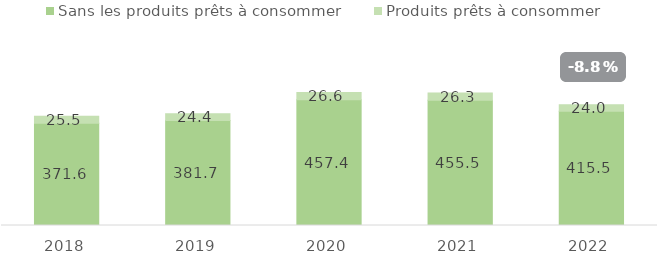
| Category | Sans les produits prêts à consommer | Produits prêts à consommer |
|---|---|---|
| 2018.0 | 371.594 | 25.535 |
| 2019.0 | 381.664 | 24.445 |
| 2020.0 | 457.377 | 26.612 |
| 2021.0 | 455.456 | 26.339 |
| 2022.0 | 415.499 | 23.983 |